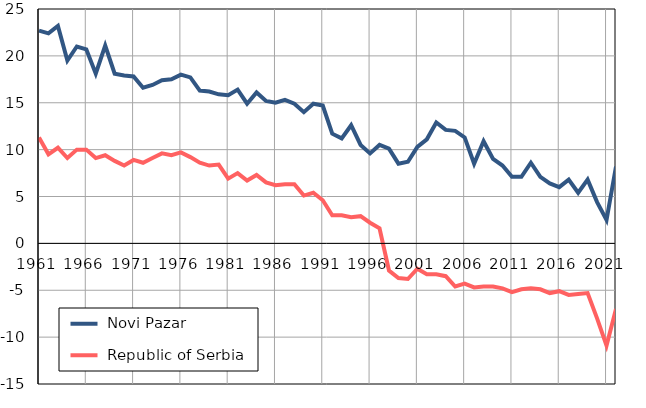
| Category |  Novi Pazar |  Republic of Serbia |
|---|---|---|
| 1961.0 | 22.7 | 11.3 |
| 1962.0 | 22.4 | 9.5 |
| 1963.0 | 23.2 | 10.2 |
| 1964.0 | 19.5 | 9.1 |
| 1965.0 | 21 | 10 |
| 1966.0 | 20.7 | 10 |
| 1967.0 | 18.1 | 9.1 |
| 1968.0 | 21.1 | 9.4 |
| 1969.0 | 18.1 | 8.8 |
| 1970.0 | 17.9 | 8.3 |
| 1971.0 | 17.8 | 8.9 |
| 1972.0 | 16.6 | 8.6 |
| 1973.0 | 16.9 | 9.1 |
| 1974.0 | 17.4 | 9.6 |
| 1975.0 | 17.5 | 9.4 |
| 1976.0 | 18 | 9.7 |
| 1977.0 | 17.7 | 9.2 |
| 1978.0 | 16.3 | 8.6 |
| 1979.0 | 16.2 | 8.3 |
| 1980.0 | 15.9 | 8.4 |
| 1981.0 | 15.8 | 6.9 |
| 1982.0 | 16.4 | 7.5 |
| 1983.0 | 14.9 | 6.7 |
| 1984.0 | 16.1 | 7.3 |
| 1985.0 | 15.2 | 6.5 |
| 1986.0 | 15 | 6.2 |
| 1987.0 | 15.3 | 6.3 |
| 1988.0 | 14.9 | 6.3 |
| 1989.0 | 14 | 5.1 |
| 1990.0 | 14.9 | 5.4 |
| 1991.0 | 14.7 | 4.6 |
| 1992.0 | 11.7 | 3 |
| 1993.0 | 11.2 | 3 |
| 1994.0 | 12.6 | 2.8 |
| 1995.0 | 10.5 | 2.9 |
| 1996.0 | 9.6 | 2.2 |
| 1997.0 | 10.5 | 1.6 |
| 1998.0 | 10.1 | -2.9 |
| 1999.0 | 8.5 | -3.7 |
| 2000.0 | 8.7 | -3.8 |
| 2001.0 | 10.3 | -2.7 |
| 2002.0 | 11.1 | -3.3 |
| 2003.0 | 12.9 | -3.3 |
| 2004.0 | 12.1 | -3.5 |
| 2005.0 | 12 | -4.6 |
| 2006.0 | 11.3 | -4.3 |
| 2007.0 | 8.5 | -4.7 |
| 2008.0 | 10.9 | -4.6 |
| 2009.0 | 9 | -4.6 |
| 2010.0 | 8.3 | -4.8 |
| 2011.0 | 7.1 | -5.2 |
| 2012.0 | 7.1 | -4.9 |
| 2013.0 | 8.6 | -4.8 |
| 2014.0 | 7.1 | -4.9 |
| 2015.0 | 6.4 | -5.3 |
| 2016.0 | 6 | -5.1 |
| 2017.0 | 6.8 | -5.5 |
| 2018.0 | 5.4 | -5.4 |
| 2019.0 | 6.8 | -5.3 |
| 2020.0 | 4.4 | -8 |
| 2021.0 | 2.5 | -10.9 |
| 2022.0 | 8.2 | -7 |